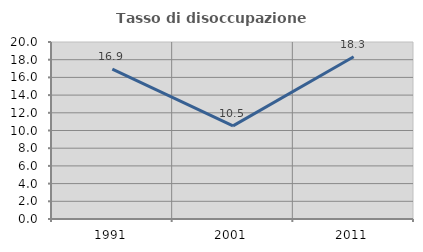
| Category | Tasso di disoccupazione giovanile  |
|---|---|
| 1991.0 | 16.923 |
| 2001.0 | 10.526 |
| 2011.0 | 18.333 |